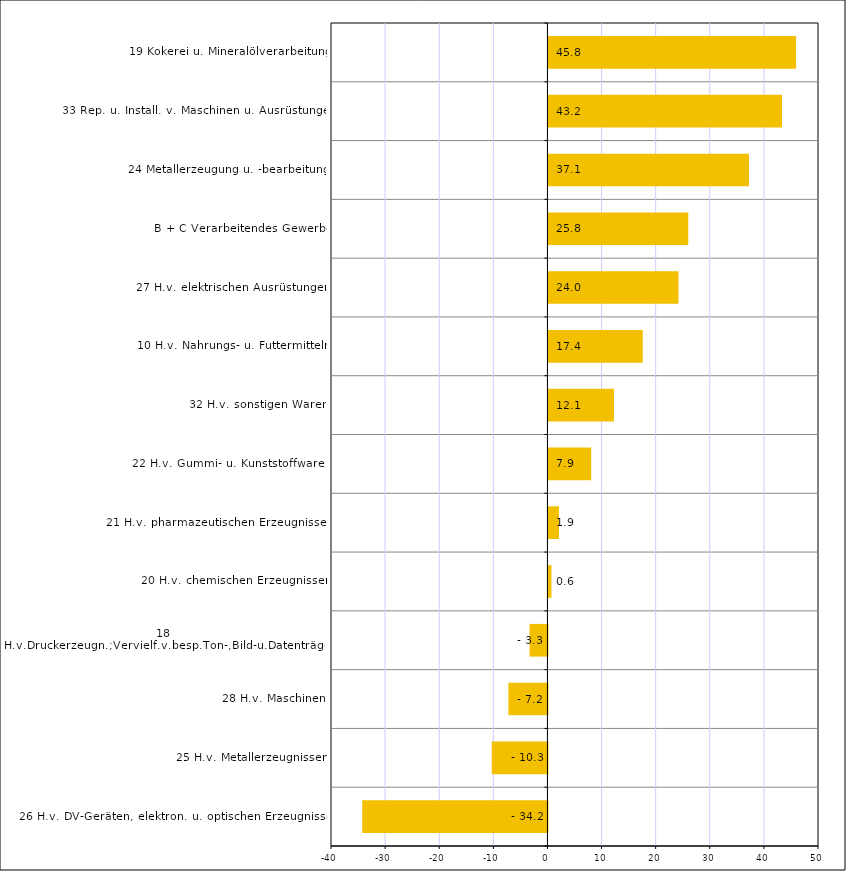
| Category | Series 0 |
|---|---|
| 26 H.v. DV-Geräten, elektron. u. optischen Erzeugnissen | -34.236 |
| 25 H.v. Metallerzeugnissen | -10.295 |
| 28 H.v. Maschinen | -7.21 |
| 18 H.v.Druckerzeugn.;Vervielf.v.besp.Ton-,Bild-u.Datenträgern | -3.311 |
| 20 H.v. chemischen Erzeugnissen | 0.553 |
| 21 H.v. pharmazeutischen Erzeugnissen | 1.948 |
| 22 H.v. Gummi- u. Kunststoffwaren | 7.905 |
| 32 H.v. sonstigen Waren | 12.11 |
| 10 H.v. Nahrungs- u. Futtermitteln | 17.431 |
| 27 H.v. elektrischen Ausrüstungen | 24.037 |
| B + C Verarbeitendes Gewerbe | 25.837 |
| 24 Metallerzeugung u. -bearbeitung | 37.057 |
| 33 Rep. u. Install. v. Maschinen u. Ausrüstungen | 43.162 |
| 19 Kokerei u. Mineralölverarbeitung | 45.774 |